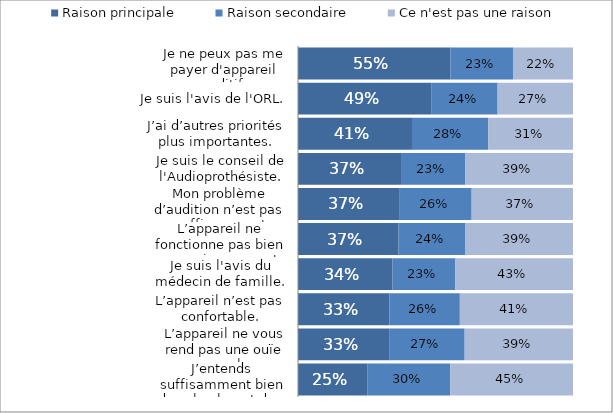
| Category | Raison principale | Raison secondaire | Ce n'est pas une raison |
|---|---|---|---|
| J’entends suffisamment bien dans la plupart des cas. | 0.252 | 0.302 | 0.447 |
| L’appareil ne vous rend pas une ouïe normale. | 0.331 | 0.275 | 0.394 |
| L’appareil n’est pas confortable. | 0.332 | 0.256 | 0.411 |
| Je suis l'avis du médecin de famille. | 0.344 | 0.229 | 0.428 |
| L’appareil ne fonctionne pas bien en environnement bruyant. | 0.366 | 0.243 | 0.391 |
| Mon problème d’audition n’est pas suffisamment important. | 0.37 | 0.261 | 0.369 |
| Je suis le conseil de l'Audioprothésiste. | 0.375 | 0.233 | 0.392 |
| J’ai d’autres priorités plus importantes. | 0.415 | 0.277 | 0.309 |
| Je suis l'avis de l'ORL. | 0.486 | 0.24 | 0.274 |
| Je ne peux pas me payer d'appareil auditif. | 0.554 | 0.227 | 0.218 |